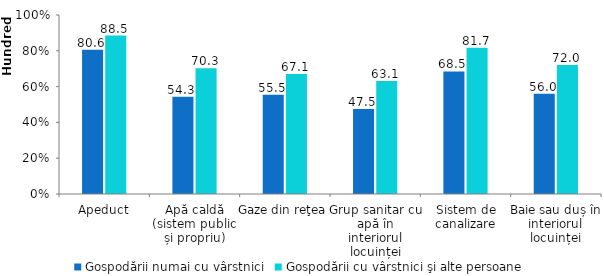
| Category | Gospodării numai cu vârstnici | Gospodării cu vârstnici şi alte persoane |
|---|---|---|
| Apeduct | 80.6 | 88.5 |
| Apă caldă (sistem public și propriu) | 54.3 | 70.3 |
| Gaze din reţea | 55.5 | 67.1 |
| Grup sanitar cu apă în interiorul locuinței | 47.5 | 63.1 |
| Sistem de canalizare | 68.5 | 81.7 |
| Baie sau duș în interiorul locuinței | 56 | 72 |